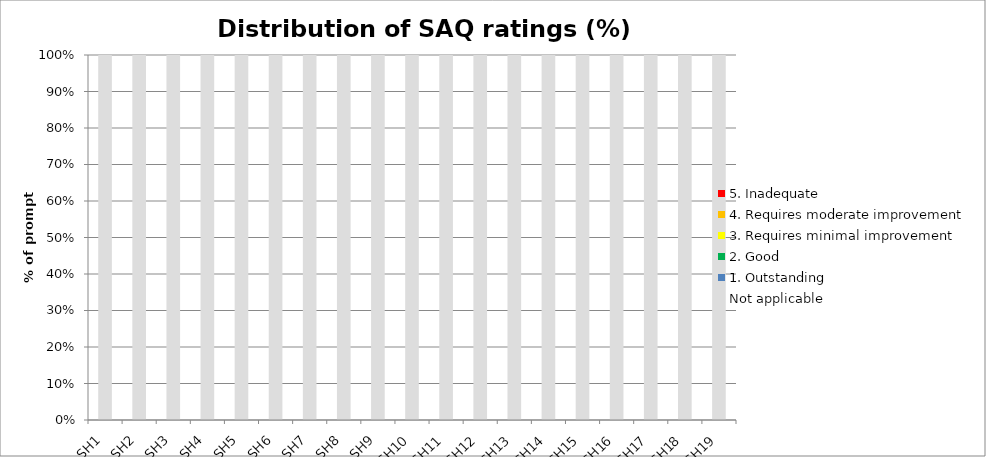
| Category | Not applicable | 1. Outstanding | 2. Good | 3. Requires minimal improvement | 4. Requires moderate improvement | 5. Inadequate |
|---|---|---|---|---|---|---|
| SH1 | 1 | 0 | 0 | 0 | 0 | 0 |
| SH2 | 1 | 0 | 0 | 0 | 0 | 0 |
| SH3 | 1 | 0 | 0 | 0 | 0 | 0 |
| SH4 | 1 | 0 | 0 | 0 | 0 | 0 |
| SH5 | 1 | 0 | 0 | 0 | 0 | 0 |
| SH6 | 1 | 0 | 0 | 0 | 0 | 0 |
| SH7 | 1 | 0 | 0 | 0 | 0 | 0 |
| SH8 | 1 | 0 | 0 | 0 | 0 | 0 |
| SH9 | 1 | 0 | 0 | 0 | 0 | 0 |
| SH10 | 1 | 0 | 0 | 0 | 0 | 0 |
| SH11 | 1 | 0 | 0 | 0 | 0 | 0 |
| SH12 | 1 | 0 | 0 | 0 | 0 | 0 |
| SH13 | 1 | 0 | 0 | 0 | 0 | 0 |
| SH14 | 1 | 0 | 0 | 0 | 0 | 0 |
| SH15 | 1 | 0 | 0 | 0 | 0 | 0 |
| SH16 | 1 | 0 | 0 | 0 | 0 | 0 |
| SH17 | 1 | 0 | 0 | 0 | 0 | 0 |
| SH18 | 1 | 0 | 0 | 0 | 0 | 0 |
| SH19 | 1 | 0 | 0 | 0 | 0 | 0 |